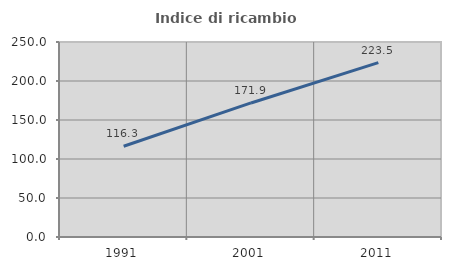
| Category | Indice di ricambio occupazionale  |
|---|---|
| 1991.0 | 116.346 |
| 2001.0 | 171.861 |
| 2011.0 | 223.518 |